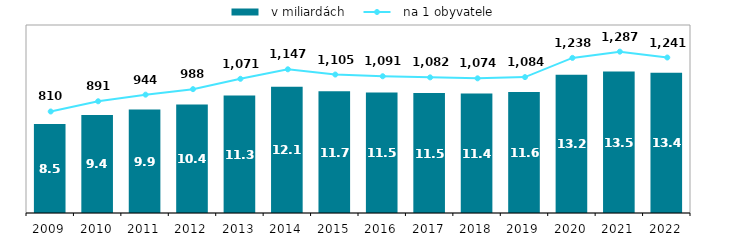
| Category |   v miliardách |
|---|---|
| 2009.0 | 8.51 |
| 2010.0 | 9.389 |
| 2011.0 | 9.919 |
| 2012.0 | 10.392 |
| 2013.0 | 11.255 |
| 2014.0 | 12.082 |
| 2015.0 | 11.66 |
| 2016.0 | 11.544 |
| 2017.0 | 11.482 |
| 2018.0 | 11.443 |
| 2019.0 | 11.595 |
| 2020.0 | 13.244 |
| 2021.0 | 13.537 |
| 2022.0 | 13.433 |